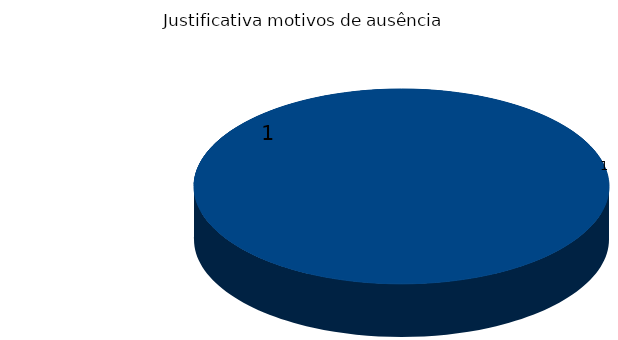
| Category | MS |
|---|---|
| 0 | 1 |